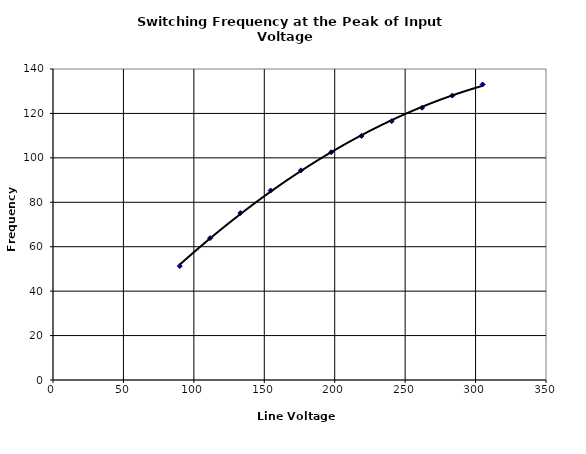
| Category | Series 0 |
|---|---|
| 90.0 | 51.3 |
| 111.5 | 63.854 |
| 133.0 | 75.159 |
| 154.5 | 85.293 |
| 176.0 | 94.376 |
| 197.5 | 102.532 |
| 219.0 | 109.878 |
| 240.5 | 116.517 |
| 262.0 | 122.54 |
| 283.5 | 128.023 |
| 305.0 | 133.032 |